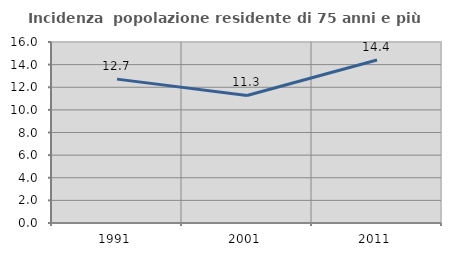
| Category | Incidenza  popolazione residente di 75 anni e più |
|---|---|
| 1991.0 | 12.719 |
| 2001.0 | 11.274 |
| 2011.0 | 14.408 |